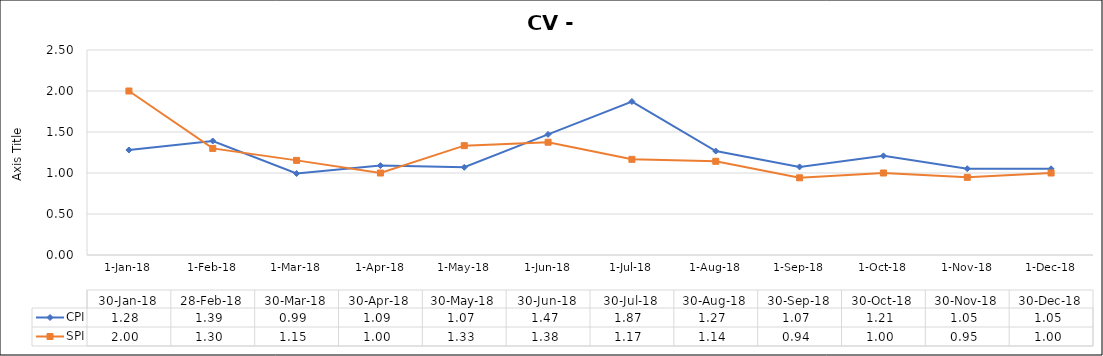
| Category | CPI | SPI |
|---|---|---|
| 2018-01-30 | 1.28 | 2 |
| 2018-02-28 | 1.39 | 1.3 |
| 2018-03-30 | 0.993 | 1.154 |
| 2018-04-30 | 1.09 | 1 |
| 2018-05-30 | 1.069 | 1.333 |
| 2018-06-30 | 1.471 | 1.375 |
| 2018-07-30 | 1.872 | 1.167 |
| 2018-08-30 | 1.268 | 1.143 |
| 2018-09-30 | 1.075 | 0.941 |
| 2018-10-30 | 1.209 | 1 |
| 2018-11-30 | 1.052 | 0.947 |
| 2018-12-30 | 1.051 | 1 |